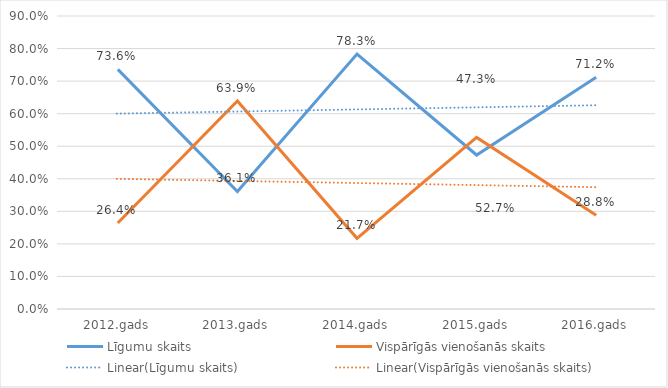
| Category | Līgumu skaits | Vispārīgās vienošanās skaits |
|---|---|---|
| 2012.gads | 0.736 | 0.264 |
| 2013.gads | 0.361 | 0.639 |
| 2014.gads | 0.783 | 0.217 |
| 2015.gads | 0.473 | 0.527 |
| 2016.gads | 0.712 | 0.288 |